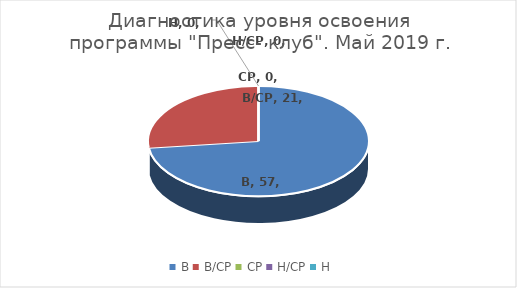
| Category | Series 0 |
|---|---|
| В | 57 |
| В/СР | 21 |
| СР | 0 |
| Н/СР | 0 |
| Н | 0 |